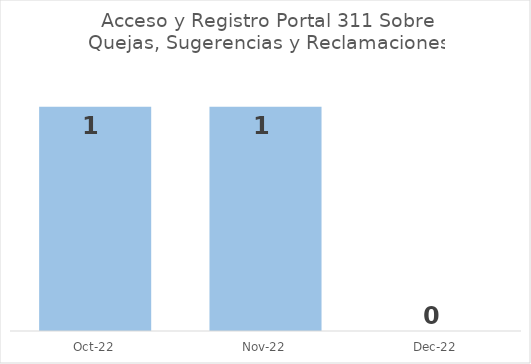
| Category | Cantidad |
|---|---|
| 2022-10-01 | 1 |
| 2022-11-01 | 1 |
| 2022-12-01 | 0 |